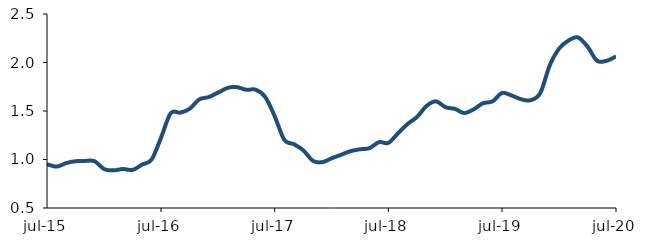
| Category | Series 0 |
|---|---|
| 2015-07-01 | 0.951 |
| 2015-08-01 | 0.927 |
| 2015-09-01 | 0.963 |
| 2015-10-01 | 0.982 |
| 2015-11-01 | 0.986 |
| 2015-12-01 | 0.982 |
| 2016-01-01 | 0.9 |
| 2016-02-01 | 0.888 |
| 2016-03-01 | 0.902 |
| 2016-04-01 | 0.892 |
| 2016-05-01 | 0.947 |
| 2016-06-01 | 1 |
| 2016-07-01 | 1.224 |
| 2016-08-01 | 1.476 |
| 2016-09-01 | 1.483 |
| 2016-10-01 | 1.523 |
| 2016-11-01 | 1.62 |
| 2016-12-01 | 1.643 |
| 2017-01-01 | 1.691 |
| 2017-02-01 | 1.739 |
| 2017-03-01 | 1.746 |
| 2017-04-01 | 1.718 |
| 2017-05-01 | 1.72 |
| 2017-06-01 | 1.643 |
| 2017-07-01 | 1.447 |
| 2017-08-01 | 1.203 |
| 2017-09-01 | 1.158 |
| 2017-10-01 | 1.094 |
| 2017-11-01 | 0.986 |
| 2017-12-01 | 0.972 |
| 2018-01-01 | 1.014 |
| 2018-02-01 | 1.051 |
| 2018-03-01 | 1.086 |
| 2018-04-01 | 1.106 |
| 2018-05-01 | 1.116 |
| 2018-06-01 | 1.179 |
| 2018-07-01 | 1.171 |
| 2018-08-01 | 1.27 |
| 2018-09-01 | 1.366 |
| 2018-10-01 | 1.438 |
| 2018-11-01 | 1.552 |
| 2018-12-01 | 1.599 |
| 2019-01-01 | 1.539 |
| 2019-02-01 | 1.521 |
| 2019-03-01 | 1.479 |
| 2019-04-01 | 1.517 |
| 2019-05-01 | 1.58 |
| 2019-06-01 | 1.6 |
| 2019-07-01 | 1.686 |
| 2019-08-01 | 1.659 |
| 2019-09-01 | 1.62 |
| 2019-10-01 | 1.612 |
| 2019-11-01 | 1.686 |
| 2019-12-01 | 1.969 |
| 2020-01-01 | 2.146 |
| 2020-02-01 | 2.229 |
| 2020-03-01 | 2.258 |
| 2020-04-01 | 2.162 |
| 2020-05-01 | 2.018 |
| 2020-06-01 | 2.018 |
| 2020-07-01 | 2.063 |